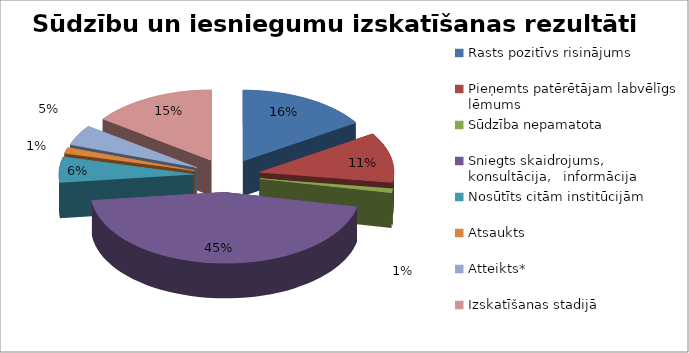
| Category | Series 0 |
|---|---|
| Rasts pozitīvs risinājums | 335 |
| Pieņemts patērētājam labvēlīgs lēmums | 241 |
| Sūdzība nepamatota | 19 |
| Sniegts skaidrojums, konsultācija,   informācija  | 948 |
| Nosūtīts citām institūcijām | 123 |
| Atsaukts | 28 |
| Atteikts* | 99 |
| Izskatīšanas stadijā | 317 |